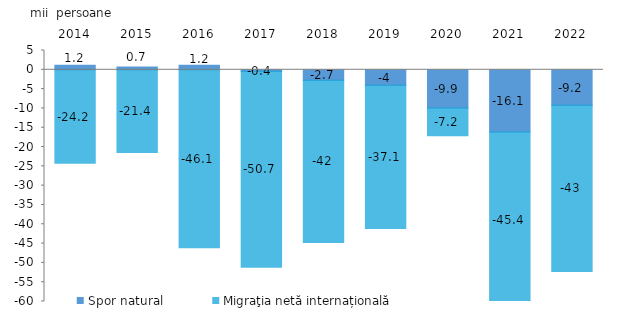
| Category | Spor natural | Migraţia netă internațională  |
|---|---|---|
| 2014.0 | 1.2 | -24.2 |
| 2015.0 | 0.7 | -21.4 |
| 2016.0 | 1.2 | -46.1 |
| 2017.0 | -0.4 | -50.7 |
| 2018.0 | -2.7 | -42 |
| 2019.0 | -4 | -37.1 |
| 2020.0 | -9.9 | -7.2 |
| 2021.0 | -16.1 | -45.4 |
| 2022.0 | -9.2 | -43 |